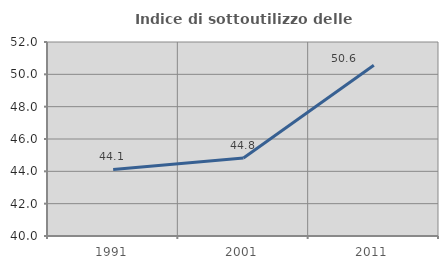
| Category | Indice di sottoutilizzo delle abitazioni  |
|---|---|
| 1991.0 | 44.118 |
| 2001.0 | 44.828 |
| 2011.0 | 50.562 |